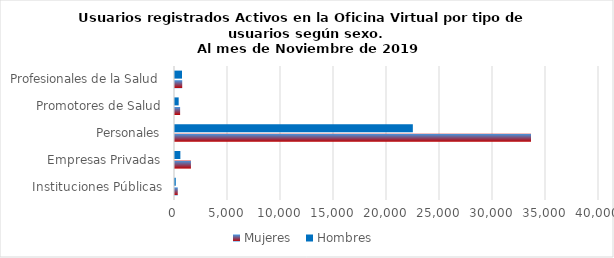
| Category | Mujeres | Hombres |
|---|---|---|
| Instituciones Públicas | 261 | 72 |
| Empresas Privadas | 1503 | 506 |
| Personales | 33585 | 22438 |
| Promotores de Salud | 483 | 347 |
| Profesionales de la Salud | 680 | 662 |